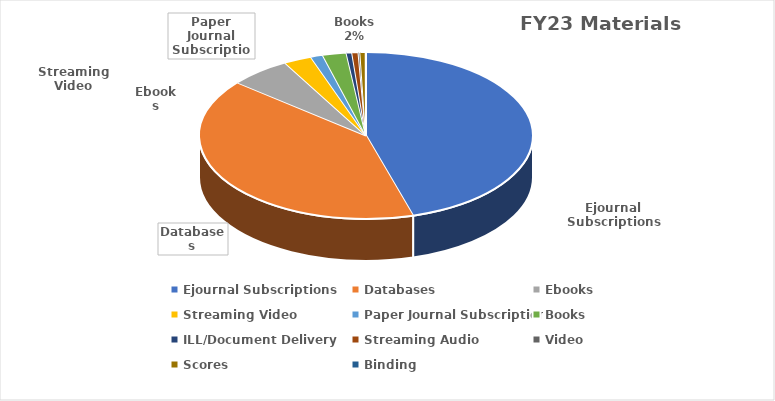
| Category | Series 0 |
|---|---|
| Ejournal Subscriptions | 364313.38 |
| Databases | 324756.5 |
| Ebooks | 47650.47 |
| Streaming Video | 21778.92 |
| Paper Journal Subscriptions | 9499.47 |
| Books | 18518.71 |
| ILL/Document Delivery | 4367.41 |
| Streaming Audio | 4895 |
| Video | 1381.16 |
| Scores | 4171.89 |
| Binding | 214 |